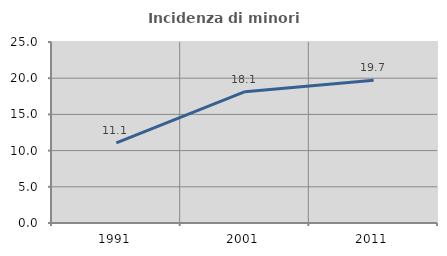
| Category | Incidenza di minori stranieri |
|---|---|
| 1991.0 | 11.08 |
| 2001.0 | 18.131 |
| 2011.0 | 19.708 |